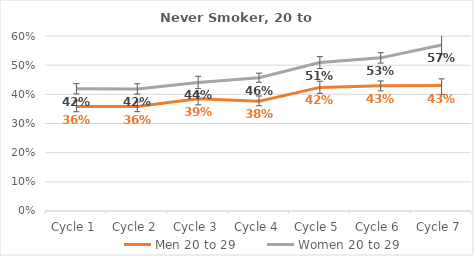
| Category | Men | Women |
|---|---|---|
| Cycle 1 | 0.358 | 0.419 |
| Cycle 2 | 0.358 | 0.419 |
| Cycle 3 | 0.385 | 0.441 |
| Cycle 4 | 0.376 | 0.457 |
| Cycle 5 | 0.424 | 0.509 |
| Cycle 6 | 0.43 | 0.525 |
| Cycle 7 | 0.43 | 0.569 |